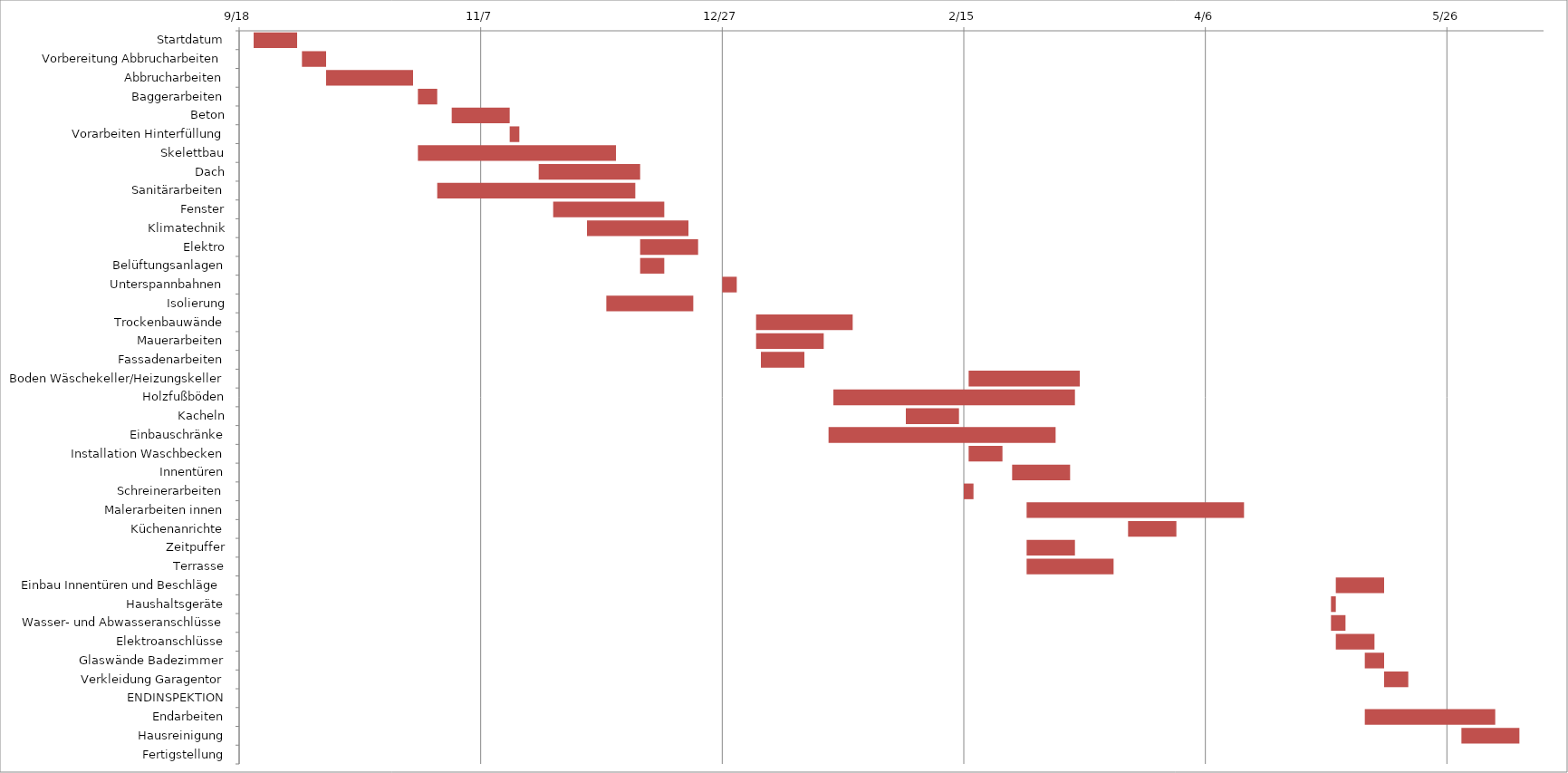
| Category | Start Date | Duration |
|---|---|---|
| Startdatum | 2014-09-21 | 9 |
| Vorbereitung Abbrucharbeiten | 2014-10-01 | 5 |
| Abbrucharbeiten | 2014-10-06 | 18 |
| Baggerarbeiten | 2014-10-25 | 4 |
| Beton | 2014-11-01 | 12 |
| Vorarbeiten Hinterfüllung | 2014-11-13 | 2 |
| Skelettbau | 2014-10-25 | 41 |
| Dach | 2014-11-19 | 21 |
| Sanitärarbeiten | 2014-10-29 | 41 |
| Fenster | 2014-11-22 | 23 |
| Klimatechnik | 2014-11-29 | 21 |
| Elektro | 2014-12-10 | 12 |
| Belüftungsanlagen | 2014-12-10 | 5 |
| Unterspannbahnen | 2014-12-27 | 3 |
| Isolierung | 2014-12-03 | 18 |
| Trockenbauwände | 2015-01-03 | 20 |
| Mauerarbeiten | 2015-01-03 | 14 |
| Fassadenarbeiten | 2015-01-04 | 9 |
| Boden Wäschekeller/Heizungskeller | 2015-02-16 | 23 |
| Holzfußböden | 2015-01-19 | 50 |
| Kacheln | 2015-02-03 | 11 |
| Einbauschränke | 2015-01-18 | 47 |
| Installation Waschbecken | 2015-02-16 | 7 |
| Innentüren | 2015-02-25 | 12 |
| Schreinerarbeiten | 2015-02-15 | 2 |
| Malerarbeiten innen | 2015-02-28 | 45 |
| Küchenanrichte | 2015-03-21 | 10 |
| Zeitpuffer | 2015-02-28 | 10 |
| Terrasse | 2015-02-28 | 18 |
| Einbau Innentüren und Beschläge | 2015-05-03 | 10 |
| Haushaltsgeräte | 2015-05-02 | 1 |
| Wasser- und Abwasseranschlüsse | 2015-05-02 | 3 |
| Elektroanschlüsse | 2015-05-03 | 8 |
| Glaswände Badezimmer | 2015-05-09 | 4 |
| Verkleidung Garagentor | 2015-05-13 | 5 |
| ENDINSPEKTION | 2015-05-02 | 0 |
| Endarbeiten | 2015-05-09 | 27 |
| Hausreinigung | 2015-05-29 | 12 |
| Fertigstellung | 2015-06-01 | 0 |